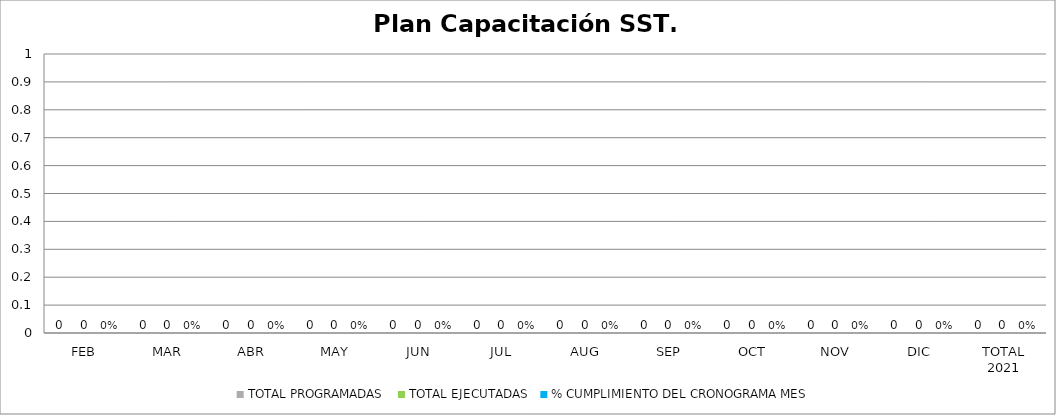
| Category | TOTAL PROGRAMADAS | TOTAL EJECUTADAS | % CUMPLIMIENTO DEL CRONOGRAMA MES |
|---|---|---|---|
| FEB | 0 | 0 | 0 |
| MAR | 0 | 0 | 0 |
| ABR | 0 | 0 | 0 |
| MAY | 0 | 0 | 0 |
| JUN | 0 | 0 | 0 |
| JUL | 0 | 0 | 0 |
| AUG | 0 | 0 | 0 |
| SEP | 0 | 0 | 0 |
| OCT | 0 | 0 | 0 |
| NOV | 0 | 0 | 0 |
| DIC | 0 | 0 | 0 |
| TOTAL 2021 | 0 | 0 | 0 |